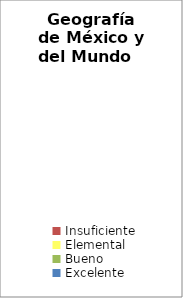
| Category | Geografía de México y del Mundo |
|---|---|
| Insuficiente | 0 |
| Elemental | 0 |
| Bueno | 0 |
| Excelente | 0 |